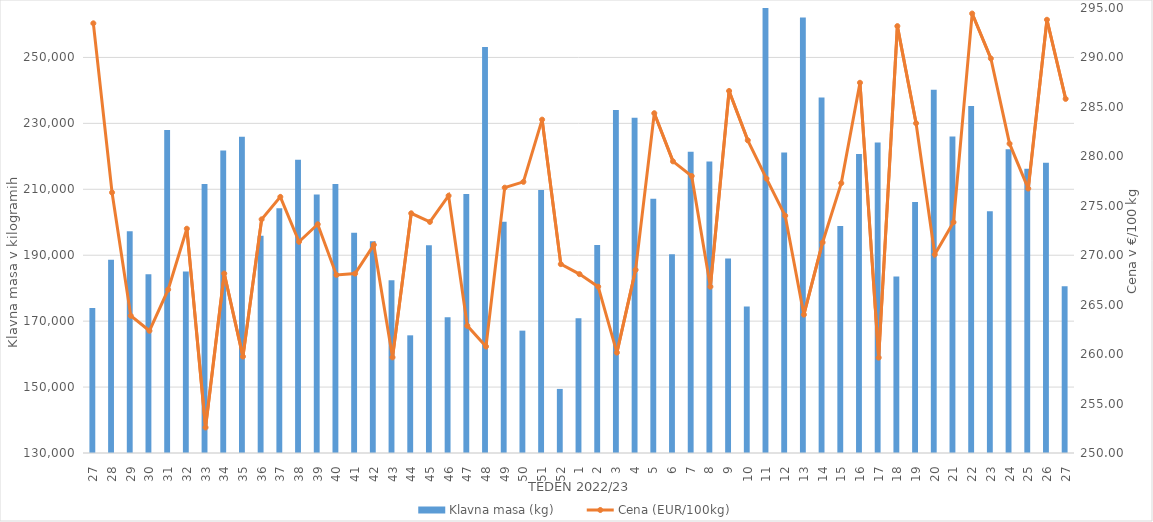
| Category | Klavna masa (kg) |
|---|---|
| 27.0 | 173967 |
| 28.0 | 188601 |
| 29.0 | 197293 |
| 30.0 | 184259 |
| 31.0 | 228023 |
| 32.0 | 185079 |
| 33.0 | 211612 |
| 34.0 | 221748 |
| 35.0 | 225927 |
| 36.0 | 195924 |
| 37.0 | 204224 |
| 38.0 | 218966 |
| 39.0 | 208403 |
| 40.0 | 211635 |
| 41.0 | 196841 |
| 42.0 | 194271 |
| 43.0 | 182399 |
| 44.0 | 165696 |
| 45.0 | 193022 |
| 46.0 | 171172 |
| 47.0 | 208597 |
| 48.0 | 253151 |
| 49.0 | 200117 |
| 50.0 | 167119 |
| 51.0 | 209797 |
| 52.0 | 149439 |
| 1.0 | 170843 |
| 2.0 | 193093 |
| 3.0 | 234042 |
| 4.0 | 231737 |
| 5.0 | 207136 |
| 6.0 | 190311 |
| 7.0 | 221366 |
| 8.0 | 218470 |
| 9.0 | 189006 |
| 10.0 | 174425 |
| 11.0 | 265476 |
| 12.0 | 221171 |
| 13.0 | 262102 |
| 14.0 | 237813 |
| 15.0 | 198828 |
| 16.0 | 220686 |
| 17.0 | 224192 |
| 18.0 | 183508 |
| 19.0 | 206133 |
| 20.0 | 240223 |
| 21.0 | 226050 |
| 22.0 | 235273 |
| 23.0 | 203306 |
| 24.0 | 222178 |
| 25.0 | 216259 |
| 26.0 | 218064 |
| 27.0 | 180556 |